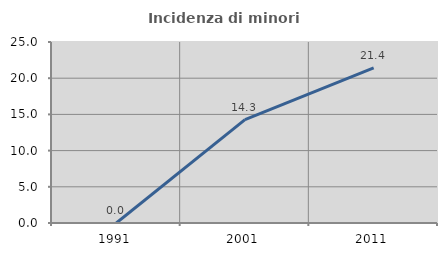
| Category | Incidenza di minori stranieri |
|---|---|
| 1991.0 | 0 |
| 2001.0 | 14.286 |
| 2011.0 | 21.429 |